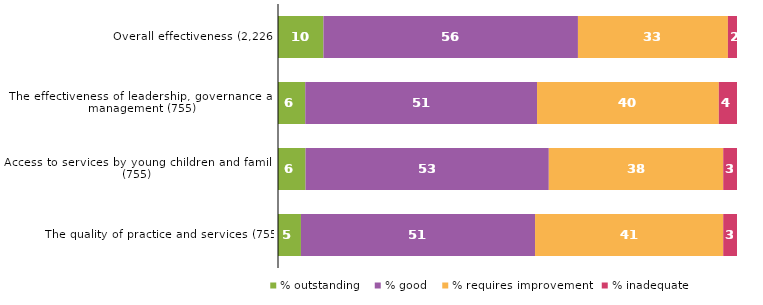
| Category | % outstanding | % good | % requires improvement | % inadequate |
|---|---|---|---|---|
| Overall effectiveness (2,226) | 10 | 56 | 33 | 2 |
| The effectiveness of leadership, governance and management (755) | 6 | 51 | 40 | 4 |
| Access to services by young children and families (755) | 6 | 53 | 38 | 3 |
| The quality of practice and services (755) | 5 | 51 | 41 | 3 |